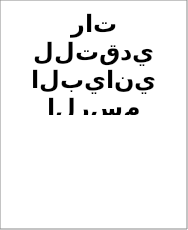
| Category | Series 0 | Series 1 |
|---|---|---|
| ممتاز مرتفع  | 0 |  |
| ممتاز   | 0 |  |
| جيد جدا مرتفع | 0 |  |
| جيد جدا  | 0 |  |
| جيد مرتفع  | 0 |  |
| جيد | 0 |  |
| مقبول مرتفع | 0 |  |
| مقبول   | 0 |  |
| ضعيف | 0 |  |
| راسب | 0 |  |
| محروم | 0 |  |